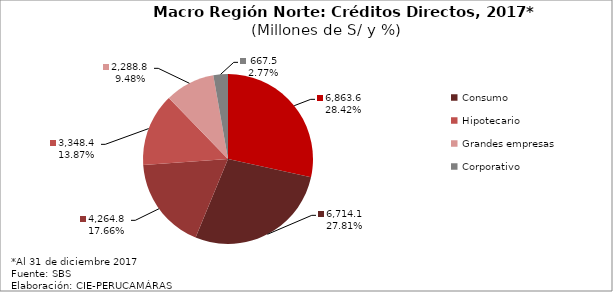
| Category | Series 0 |
|---|---|
| PyMes | 6863.625 |
| Consumo | 6714.108 |
| Medianas empresas | 4264.84 |
| Hipotecario | 3348.404 |
| Grandes empresas | 2288.771 |
| Corporativo | 667.548 |